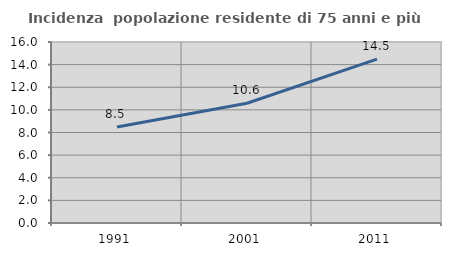
| Category | Incidenza  popolazione residente di 75 anni e più |
|---|---|
| 1991.0 | 8.493 |
| 2001.0 | 10.588 |
| 2011.0 | 14.484 |